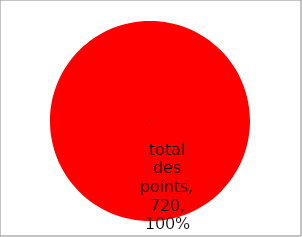
| Category | Series 0 |
|---|---|
| total des points | 720 |
| points manquants | 0 |